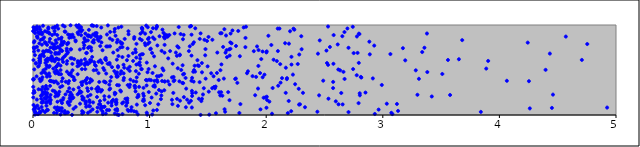
| Category | points |
|---|---|
| 0.28109599546678643 | 0.37 |
| 0.7863113055044358 | 0.845 |
| 1.2960913309117656 | 0.458 |
| 2.801998188422754 | 0.241 |
| 0.16181771673105594 | 0.604 |
| 0.9099683410911414 | 0.313 |
| 0.2542195787087051 | 0.408 |
| 0.7645871088876175 | 0.129 |
| 3.0653831028318614 | 0.677 |
| 0.04536244996746247 | 0.718 |
| 0.4148154742614242 | 0.255 |
| 0.612126337397182 | 0.209 |
| 0.9644126474792283 | 0.775 |
| 0.873292841236084 | 0.321 |
| 0.5744103137600461 | 0.155 |
| 0.8451699118751538 | 0.087 |
| 0.7014837666001149 | 0.956 |
| 0.7099957449931591 | 0.145 |
| 2.185443102822599 | 0.021 |
| 0.36488459420857033 | 0.829 |
| 0.7483094901119125 | 0.749 |
| 0.5154298040868802 | 0.14 |
| 1.422651659300616 | 0.181 |
| 0.11989597269200629 | 0.057 |
| 0.6742393291927324 | 0.105 |
| 1.3457181253958346 | 0.983 |
| 0.3166395095342625 | 0.217 |
| 0.16368926789285895 | 0.374 |
| 4.396175380391123 | 0.502 |
| 1.449192109160035 | 0.181 |
| 0.8124454490234898 | 0.332 |
| 0.6810174015349051 | 0.833 |
| 0.47061576387367976 | 0.828 |
| 1.4928285260325076 | 0.823 |
| 0.10559555967818714 | 0.234 |
| 0.13768098370966286 | 0.623 |
| 2.8887228357666133 | 0.674 |
| 1.4373071451709571 | 0.001 |
| 0.5260832207862275 | 0.587 |
| 0.7567741580359515 | 0.486 |
| 0.08518163146052737 | 0.156 |
| 0.19685831735046003 | 0.373 |
| 0.392828271827794 | 0.998 |
| 0.5034215476512914 | 0.996 |
| 0.9795665728010211 | 0.004 |
| 0.21746152402796293 | 0.569 |
| 0.807878517876689 | 0.134 |
| 0.29803660633935847 | 0.261 |
| 1.4478551683098297 | 0.577 |
| 0.008178629830245216 | 0.941 |
| 0.47750710594813695 | 0.88 |
| 1.822530957515877 | 0.856 |
| 0.10671213407645605 | 0.467 |
| 0.006809696880390757 | 0.397 |
| 1.9054204492945668 | 0.22 |
| 0.0022782317432472787 | 0.313 |
| 1.0565834999774417 | 0.238 |
| 1.4579257487413357 | 0.228 |
| 0.0066864243649958615 | 0.063 |
| 0.33525322000933105 | 0.182 |
| 0.8183220600249549 | 0.931 |
| 0.6975341210572045 | 0.488 |
| 0.010750208368703718 | 0.507 |
| 0.10274954593767766 | 0.93 |
| 1.8069591114970132 | 0.973 |
| 0.959359405926713 | 0.797 |
| 1.1570745501055428 | 0.374 |
| 0.6606424603605228 | 0.763 |
| 0.45542686348208516 | 0.149 |
| 1.5806516231195562 | 0.694 |
| 0.11711094740435125 | 0.229 |
| 1.5925587263448266 | 0.389 |
| 0.4323568750636553 | 0.17 |
| 0.2027263688608558 | 0.227 |
| 0.6401813209262813 | 0.57 |
| 0.17886499053350619 | 0.76 |
| 0.9744953770770636 | 0.328 |
| 1.2129411898262499 | 0.386 |
| 2.803512167857224 | 0.219 |
| 1.2339223007660027 | 0.657 |
| 0.8269142348347855 | 0.311 |
| 0.7227250923707312 | 0.006 |
| 0.4341578709901733 | 0.188 |
| 1.1954309971878077 | 0.121 |
| 2.652905260697742 | 0.875 |
| 2.7424425200390514 | 0.98 |
| 0.8051974629276178 | 0.143 |
| 2.7922946595932987 | 0.132 |
| 0.9489018695530124 | 0.176 |
| 1.0056012574371316 | 0.73 |
| 1.0996098690126193 | 0.442 |
| 0.623558677678183 | 0.361 |
| 0.3519580090501742 | 0.388 |
| 0.9077061325484465 | 0.459 |
| 0.212237688164748 | 0.757 |
| 0.318946827018784 | 0.15 |
| 0.3387722002727237 | 0.497 |
| 0.5353025863967446 | 0.877 |
| 2.13573315948738 | 0.409 |
| 0.40110861922577096 | 0.961 |
| 0.5112625787391253 | 0.062 |
| 0.3245431471020181 | 0.469 |
| 0.2936352133835687 | 0.787 |
| 0.4200373317503611 | 0.332 |
| 0.0022848786733070275 | 0.195 |
| 0.31454162487060655 | 0.185 |
| 0.06812205454689393 | 0.214 |
| 0.0029337382212216174 | 0.244 |
| 0.8822210689926815 | 0.487 |
| 0.29314228519259977 | 0.599 |
| 0.44322407191111723 | 0.84 |
| 0.147578795186086 | 0.625 |
| 1.1297907326937762 | 0.372 |
| 2.3154472970948254 | 0.246 |
| 2.176828873901453 | 0.398 |
| 0.29333463026984513 | 0.027 |
| 0.056577576162750255 | 0.4 |
| 0.8079132622280998 | 0.163 |
| 0.19301264486308106 | 0.748 |
| 0.5020560081204197 | 0.294 |
| 2.055290407586321 | 0.3 |
| 1.3779084621896573 | 0.371 |
| 3.13094968759662 | 0.046 |
| 0.6882769841099661 | 0.694 |
| 2.931168546218482 | 0.012 |
| 2.007725879750936 | 0.166 |
| 0.5770121253037834 | 0.857 |
| 0.8875025714419036 | 0.79 |
| 0.109141298462907 | 0.138 |
| 2.6134535740845983 | 0.784 |
| 1.8435997124892947 | 0.485 |
| 0.09863526435711628 | 0.702 |
| 2.884699186741174 | 0.815 |
| 1.311054185262152 | 0.086 |
| 5.3678784736487755 | 0.924 |
| 1.0739602473624885 | 0.118 |
| 0.033316075998391766 | 0.172 |
| 2.5339215925984524 | 0.181 |
| 2.283355356788008 | 0.672 |
| 0.7149654790019342 | 0.169 |
| 0.13095624996995522 | 0.958 |
| 0.004829298563082712 | 0.111 |
| 0.054134368203893404 | 0.795 |
| 1.283237326959879 | 0.553 |
| 0.5385145127430865 | 0.547 |
| 0.20743869203960538 | 0.992 |
| 0.9326941394640169 | 0.832 |
| 4.063943305541932 | 0.38 |
| 0.2361921551673881 | 0.548 |
| 0.6774797686923697 | 0.532 |
| 1.9345039205951968 | 0.721 |
| 0.7105825761295621 | 0.461 |
| 0.082745944338072 | 0.842 |
| 0.4853196671499762 | 0.879 |
| 1.096886526744139 | 0.176 |
| 0.5781437560162342 | 0.608 |
| 0.4892280986597576 | 0.096 |
| 0.12805181909543295 | 0.71 |
| 1.7699777814772488 | 0.022 |
| 0.0737890043361841 | 0.089 |
| 0.007978863445438246 | 0.806 |
| 3.3381410877551025 | 0.7 |
| 0.7669797201095317 | 0.644 |
| 1.9689947017046536 | 0.705 |
| 0.9033157007221936 | 0.225 |
| 0.3279914838374465 | 0.864 |
| 0.11923399621002748 | 0.05 |
| 0.19252998704531588 | 0.692 |
| 0.6278223789605939 | 0.461 |
| 0.9515608912782906 | 0.159 |
| 2.7950119231850015 | 0.904 |
| 0.3382113918667821 | 0.892 |
| 0.7073251374211335 | 0.242 |
| 1.4436310053345691 | 0.155 |
| 0.012571956811455507 | 0.251 |
| 2.530645478161302 | 0.557 |
| 1.022382369256952 | 0.006 |
| 1.5051274621728012 | 0.867 |
| 1.2412742147599052 | 0.519 |
| 3.3097977684137514 | 0.402 |
| 0.0007125348984679613 | 0.931 |
| 1.2578947214941063 | 0.663 |
| 0.05928462601509663 | 0.6 |
| 1.7604783932774395 | 0.934 |
| 4.432937171214745 | 0.682 |
| 0.07396418220168405 | 0.138 |
| 0.7578740032469024 | 0.98 |
| 0.06258506301556925 | 0.03 |
| 0.8292544833722038 | 0.49 |
| 0.003081269725103933 | 0.4 |
| 0.37147364615655337 | 0.995 |
| 1.1314671297863932 | 0.893 |
| 0.64231744490566 | 0.995 |
| 0.04782264155743999 | 0.286 |
| 0.07247311004661848 | 0.281 |
| 0.602877747344754 | 0.522 |
| 0.16393246131728018 | 0.888 |
| 0.33347912232007315 | 0.63 |
| 0.1100074077062833 | 0.798 |
| 0.1827011537346755 | 0.783 |
| 0.08287708891898421 | 0.233 |
| 0.19575961709494039 | 0.245 |
| 1.537235309482441 | 0.298 |
| 0.4712694916683558 | 0.267 |
| 2.705874692811272 | 0.747 |
| 0.24493897495769895 | 0.86 |
| 3.2828641155872913 | 0.496 |
| 3.6526011269044707 | 0.619 |
| 0.08614308286067045 | 0.992 |
| 0.13820158907321423 | 0.461 |
| 0.23719459273321641 | 0.775 |
| 4.261087284803229 | 0.073 |
| 4.707008862425556 | 0.612 |
| 0.8313490500352786 | 0.337 |
| 1.5384331424477156 | 0.836 |
| 0.08695615625192396 | 0.708 |
| 1.5521669434289873 | 0.311 |
| 0.3464843160264727 | 0.284 |
| 2.2292237406145414 | 0.449 |
| 0.722487358809856 | 0.435 |
| 0.4225660772888632 | 0.943 |
| 1.4224575041915126 | 0.545 |
| 0.9333337315708011 | 0.969 |
| 0.24066424968977007 | 0.453 |
| 0.7765041872390942 | 0.387 |
| 1.021335708361039 | 0.69 |
| 0.0789922464721686 | 0.912 |
| 2.6202276750776274 | 0.119 |
| 2.81573894137024 | 0.416 |
| 0.05504963456946509 | 0.602 |
| 0.5097903251077099 | 0.995 |
| 0.08231457284524905 | 0.051 |
| 0.5853078636823724 | 0.972 |
| 0.5843099716949577 | 0.079 |
| 3.381874532150111 | 0.477 |
| 0.4611513185513976 | 0.587 |
| 0.05869603538204341 | 0.594 |
| 0.07826264756854798 | 0.897 |
| 2.1204246293519318 | 0.565 |
| 0.7672641369130531 | 0.01 |
| 1.0459982700545705 | 0.541 |
| 2.530333529028507 | 0.983 |
| 0.055598946173039954 | 0.022 |
| 0.3006022124864148 | 0.696 |
| 4.24310937013456 | 0.804 |
| 0.7020071490459109 | 0.229 |
| 1.7410027817509297 | 0.767 |
| 0.013781992752652933 | 0.963 |
| 0.15191813977437466 | 0.168 |
| 1.1488812171439768 | 0.872 |
| 0.7128726296221539 | 0.144 |
| 0.7018437598503873 | 0.016 |
| 0.3848072123922433 | 0.577 |
| 0.17714973162236702 | 0.372 |
| 1.281327949112206 | 0.356 |
| 0.08437236263472873 | 0.255 |
| 0.44496366248436264 | 0.573 |
| 0.21797122184874282 | 0.458 |
| 0.07431850427141004 | 0.391 |
| 0.3831076006615354 | 0.23 |
| 1.0665897100052724 | 0.773 |
| 0.7499054237492401 | 0.457 |
| 0.8858897553679974 | 0.638 |
| 0.3490552041265348 | 0.864 |
| 0.2485106053405745 | 0.133 |
| 0.19786298137491132 | 0.245 |
| 0.80892193933003 | 0.184 |
| 0.6563034727441793 | 0.579 |
| 1.41346963096207 | 0.551 |
| 1.2881141981787085 | 0.353 |
| 0.6241367049485571 | 0.016 |
| 0.7744315962942802 | 0.141 |
| 0.2026750008820028 | 0.022 |
| 0.6618310766997146 | 0.294 |
| 0.10270850849356242 | 0.032 |
| 0.7820445342240077 | 0.526 |
| 0.12113041809410462 | 0.779 |
| 0.1411427428932185 | 0.626 |
| 0.18704497976882142 | 0.979 |
| 0.7192268910449955 | 0.435 |
| 0.42219985991350945 | 0.017 |
| 0.07046406470350466 | 0.92 |
| 2.241322056454322 | 0.948 |
| 0.4872585739206895 | 0.141 |
| 1.04095531885061 | 0.379 |
| 2.192997479925205 | 0.156 |
| 1.710555218863422 | 0.939 |
| 0.8587625413677461 | 0.6 |
| 0.23384711535749905 | 0.309 |
| 1.7031506365888855 | 0.796 |
| 0.42426124085001077 | 0.175 |
| 0.8778989138439822 | 0.728 |
| 1.0382122136398395 | 0.651 |
| 1.1690822254239759 | 0.889 |
| 0.04938423358636723 | 0.071 |
| 0.510625264913531 | 0.812 |
| 0.1852038682455222 | 0.265 |
| 0.06104560564933477 | 0.622 |
| 0.12243844337560046 | 0.445 |
| 0.300104463140919 | 0.894 |
| 2.2144442809551808 | 0.043 |
| 0.6541893245887503 | 0.338 |
| 1.3561565091904393 | 0.989 |
| 2.914783547936963 | 0.407 |
| 1.062799772993714 | 0.431 |
| 3.1724220433503847 | 0.742 |
| 0.3218597970587679 | 0.631 |
| 0.5767259991117617 | 0.766 |
| 0.3032584018100012 | 0.352 |
| 0.4398718883710106 | 0.775 |
| 1.122741282719865 | 0.867 |
| 0.054258030884870925 | 0.904 |
| 2.1232570168468845 | 0.359 |
| 1.8267872892064323 | 0.981 |
| 0.41216438299921765 | 0.976 |
| 0.8764185049566556 | 0.301 |
| 0.7207168633831024 | 0.066 |
| 2.5738725444416164 | 0.299 |
| 0.7063364653716339 | 0.059 |
| 0.07055532243006568 | 0.181 |
| 0.5010140915530992 | 0.715 |
| 2.8111918255716457 | 0.423 |
| 0.1710159755574358 | 0.627 |
| 2.7835215413832346 | 0.69 |
| 3.840800417180243 | 0.035 |
| 0.24712857693316967 | 0.076 |
| 0.5435776433303424 | 0.499 |
| 1.6929601374907828 | 0.735 |
| 1.4649325573924084 | 0.297 |
| 0.701078518852757 | 0.246 |
| 0.2703286135846564 | 0.02 |
| 5.1697369268363165 | 0.405 |
| 0.47054613909125775 | 0.207 |
| 0.719083234334744 | 0.615 |
| 0.39183975457708775 | 0.304 |
| 1.197963225583802 | 0.57 |
| 0.08555373633922393 | 0.68 |
| 1.0805817234119277 | 0.278 |
| 0.4923809976891693 | 0.398 |
| 1.4768998939320306 | 0.663 |
| 1.0559134048996506 | 0.961 |
| 0.03620445856838365 | 0.011 |
| 0.8120153703910429 | 0.058 |
| 0.45619293943047645 | 0.092 |
| 0.985508267490779 | 0.792 |
| 0.13129727765977012 | 0.972 |
| 0.889859725692748 | 0.418 |
| 0.08300699298665425 | 0.311 |
| 0.20794927041681296 | 0.889 |
| 0.12254894973703839 | 0.596 |
| 3.886973670971107 | 0.516 |
| 0.3893822147319713 | 0.898 |
| 0.382709080093621 | 0.916 |
| 1.3589609705931598 | 0.38 |
| 0.25063374051266724 | 0.619 |
| 0.0895315716433798 | 0.498 |
| 0.34578899725830625 | 0.192 |
| 0.22602339550302494 | 0.454 |
| 0.258899216711934 | 0.798 |
| 0.41921593185905326 | 0.509 |
| 0.026052861642226015 | 0.952 |
| 1.497654848473924 | 0.54 |
| 1.1100355551914933 | 0.948 |
| 0.15408973354757566 | 0.695 |
| 0.25621796717009343 | 0.995 |
| 1.1760638938127321 | 0.71 |
| 0.08054341098711569 | 0.138 |
| 0.0809733603380016 | 0.672 |
| 0.44476345567637815 | 0.554 |
| 0.13626572399641282 | 0.534 |
| 0.20046562890798353 | 0.495 |
| 0.4008246147630076 | 0.937 |
| 0.11162834934632826 | 0.323 |
| 1.243017299613853 | 0.102 |
| 0.6084460301092673 | 0.089 |
| 0.5661987176149319 | 0.291 |
| 0.5513771130280278 | 0.036 |
| 0.6191025464100501 | 0.366 |
| 0.20516792724005756 | 0.625 |
| 1.147367444803431 | 0.887 |
| 1.3917657855627361 | 0.963 |
| 1.2353789528448378 | 0.179 |
| 0.2227661473421627 | 0.682 |
| 1.2867628197833552 | 0.451 |
| 0.9312814195358193 | 0.51 |
| 0.2982941836935158 | 0.145 |
| 0.7250728812877498 | 0.722 |
| 0.6572814019277251 | 0.563 |
| 0.01855532299692703 | 0.943 |
| 2.1674277121121923 | 0.246 |
| 2.2900073388027877 | 0.118 |
| 0.6138329759114716 | 0.093 |
| 1.6065426736678574 | 0.908 |
| 0.060428214277214044 | 0.037 |
| 1.507444024409943 | 0.259 |
| 0.45456145717111923 | 0.39 |
| 1.2715010190812632 | 0.5 |
| 0.10715772795292647 | 0.58 |
| 2.102939477918318 | 0.325 |
| 2.991317083843083 | 0.334 |
| 0.4498651677147833 | 0.383 |
| 0.1638682126220233 | 0.793 |
| 0.9841803338928676 | 0.975 |
| 0.9419083074057217 | 0.676 |
| 0.3838157029365343 | 0.976 |
| 0.19132194113010334 | 0.206 |
| 0.29131680125147347 | 0.482 |
| 0.7220153391527837 | 0.048 |
| 0.7217153344213063 | 0.473 |
| 0.5918633832321389 | 0.276 |
| 1.893559574581589 | 0.709 |
| 0.28954593303854514 | 0.737 |
| 1.6511612095137789 | 0.693 |
| 0.0647216826967528 | 0.904 |
| 0.9777528345318611 | 0.385 |
| 0.671159029029341 | 0.422 |
| 0.393341584105714 | 0.588 |
| 1.0625433055509481 | 0.388 |
| 0.2895876923905509 | 0.713 |
| 2.0053396641472396 | 0.203 |
| 0.9863378338584825 | 0.844 |
| 0.2718247555139437 | 0.928 |
| 0.1882784419434141 | 0.97 |
| 0.25925203429756966 | 0.638 |
| 0.7292571093599025 | 0.529 |
| 1.0454603999876175 | 0.314 |
| 1.7788931396368632 | 0.121 |
| 2.7763178716750336 | 0.442 |
| 1.5959269599245773 | 0.252 |
| 1.3627744387862681 | 0.083 |
| 0.7176142959087238 | 0.425 |
| 0.47949154087913604 | 0.1 |
| 1.1028863149032415 | 0.262 |
| 0.03534011521052355 | 0.872 |
| 0.1850704568307822 | 0.48 |
| 0.2365111123418804 | 0.714 |
| 1.2612105108727603 | 0.159 |
| 0.9965252176764418 | 0.392 |
| 1.3381833762961937 | 0.137 |
| 1.734229988605894 | 0.4 |
| 1.1285578206596023 | 0.373 |
| 3.6810491004513275 | 0.832 |
| 1.2055969132131796 | 0.423 |
| 0.4507777693257991 | 0.145 |
| 1.3899772565426078 | 0.482 |
| 0.7349646292061113 | 0.001 |
| 0.36573403547281097 | 0.818 |
| 1.2486045880542853 | 0.749 |
| 0.21927045698831096 | 0.229 |
| 1.1918073140101417 | 0.169 |
| 0.14799218432479605 | 0.128 |
| 0.546087437313917 | 0.988 |
| 3.1923197754024697 | 0.607 |
| 0.7669588911105172 | 0.754 |
| 0.47069697739247784 | 0.565 |
| 2.643831953019708 | 0.245 |
| 0.6980302765365137 | 0.925 |
| 0.38445566448592006 | 0.598 |
| 1.128680131207001 | 0.779 |
| 3.357006008153795 | 0.747 |
| 1.017444670734777 | 0.194 |
| 0.4883460171159643 | 0.584 |
| 0.3176450360919995 | 0.885 |
| 1.1280108041815202 | 0.692 |
| 0.4023720049606228 | 0.727 |
| 0.043833683328893286 | 0.538 |
| 0.45348356345208846 | 0.823 |
| 0.018281023532212733 | 0.077 |
| 0.41312535170195264 | 0.886 |
| 0.03882589086135381 | 0.857 |
| 0.24442172137502194 | 0.718 |
| 0.42851037272214504 | 0.368 |
| 1.3694180481033362 | 0.788 |
| 0.12458510868755533 | 0.29 |
| 0.6623205340219588 | 0.923 |
| 2.778150229178464 | 0.873 |
| 0.9708405232078278 | 0.993 |
| 0.8908139095338122 | 0.116 |
| 2.6341778323449287 | 0.496 |
| 0.14523941890953743 | 0.846 |
| 0.40400658052997107 | 0.247 |
| 1.752491361777742 | 0.357 |
| 0.004474286176450394 | 0.61 |
| 0.4213731031318589 | 0.043 |
| 0.1503210467063839 | 0.223 |
| 0.9756838055237731 | 0.026 |
| 0.1990567889323361 | 0.537 |
| 0.18024163367800333 | 0.023 |
| 0.43441902447072 | 0.742 |
| 0.26595747490501304 | 0.812 |
| 0.7991235311140632 | 0.103 |
| 3.5771166643977934 | 0.222 |
| 0.5393273240753215 | 0.896 |
| 0.003483743551144528 | 0.974 |
| 0.49822463645455817 | 0.749 |
| 0.3002182334691156 | 0.028 |
| 0.5428648744575718 | 0.29 |
| 0.43373021496923847 | 0.804 |
| 1.2254117628565226 | 0.694 |
| 0.7322035581103583 | 0.971 |
| 0.013945137112504788 | 0.061 |
| 0.3309691896689172 | 0.434 |
| 0.716170737235947 | 0.136 |
| 1.2862073997157404 | 0.842 |
| 0.22778179214083463 | 0.743 |
| 0.08079959862103257 | 0.419 |
| 0.5449261536472448 | 0.911 |
| 0.16949500242422283 | 0.97 |
| 0.9365877080710245 | 0.964 |
| 0.050272432485653634 | 0.547 |
| 0.14550826759543667 | 0.379 |
| 0.9914648479058796 | 0.511 |
| 0.18052506426823745 | 0.364 |
| 0.45735810589015186 | 0.688 |
| 0.21950237185565194 | 0.848 |
| 4.450369071319271 | 0.079 |
| 0.03723500294024522 | 0.103 |
| 0.4281741302674245 | 0.176 |
| 0.8687710525228748 | 0.866 |
| 0.2159812739295339 | 0.96 |
| 0.9300699019107727 | 0.674 |
| 0.302654560486989 | 0.802 |
| 0.4409207721140332 | 0.854 |
| 1.396051861285804 | 0.25 |
| 0.7480229940856326 | 0.272 |
| 2.5213150467792595 | 0.577 |
| 0.5620105834512061 | 0.465 |
| 0.009205572173162301 | 0.705 |
| 0.27418375170841675 | 0.656 |
| 1.7399944345155858 | 0.405 |
| 1.1595805705330933 | 0.629 |
| 1.0289073112511915 | 0.964 |
| 0.06323510147160838 | 0.644 |
| 0.26073694610403253 | 0.189 |
| 1.6306018319598623 | 0.757 |
| 0.23964994700769368 | 0.843 |
| 1.0286318449185736 | 0.861 |
| 0.1463860781876951 | 0.323 |
| 0.6345495943515735 | 0.055 |
| 0.10444672174589395 | 0.251 |
| 0.18699521021685778 | 0.083 |
| 0.20936687603012497 | 0.085 |
| 0.059563371294229096 | 0.577 |
| 0.38297540345324027 | 0.453 |
| 0.4152295283733697 | 0.57 |
| 0.5795484791360767 | 0.87 |
| 0.11720392466245025 | 0.211 |
| 0.7490392367747409 | 0.811 |
| 0.03372753318267974 | 0.757 |
| 1.2034305648208201 | 0.245 |
| 4.569811922285747 | 0.871 |
| 0.6769894778872638 | 0.154 |
| 0.39548736153161074 | 0.551 |
| 0.4791409965627206 | 0.946 |
| 0.17386683390341776 | 0.516 |
| 1.774101869413421 | 0.653 |
| 3.4202742232049403 | 0.206 |
| 0.20145954551311285 | 0.802 |
| 2.9264202567872704 | 0.771 |
| 0.6251461013194407 | 0.61 |
| 0.2895781190146845 | 0.679 |
| 2.459441937988244 | 0.829 |
| 2.45357658309203 | 0.218 |
| 1.6240940698159636 | 0.214 |
| 2.5166600022042758 | 0.716 |
| 0.08130620729127991 | 0.844 |
| 0.1156321642979422 | 0.102 |
| 0.026336799808001417 | 0.575 |
| 0.7648203122081055 | 0.796 |
| 1.560543838819416 | 0.297 |
| 1.3630729851176364 | 0.268 |
| 1.2554852427491994 | 0.374 |
| 0.4748797910501944 | 0.748 |
| 0.062076479934772985 | 0.949 |
| 1.6476780383092111 | 0.036 |
| 0.7211717649422742 | 0.332 |
| 0.23020474872212215 | 0.076 |
| 0.867122768733115 | 0.847 |
| 1.5282497811390392 | 0.463 |
| 1.3861508806890972 | 0.547 |
| 0.01744336809067719 | 0.087 |
| 0.22590543951851458 | 0.258 |
| 2.027067980867093 | 0.149 |
| 1.9474797575723675 | 0.466 |
| 0.8990775721513297 | 0.007 |
| 0.012194519765404607 | 0.821 |
| 0.4138615605074506 | 0.362 |
| 0.9928270711329233 | 0.255 |
| 2.3038801762585637 | 0.731 |
| 0.5621101493207692 | 0.592 |
| 0.8564119141986372 | 0.686 |
| 0.45203077660219315 | 0.122 |
| 2.2047225029273694 | 0.93 |
| 2.5744093414323768 | 0.368 |
| 0.5210955917082604 | 0.833 |
| 0.07283033120972528 | 0.465 |
| 1.2061984294272932 | 0.376 |
| 1.119278480833139 | 0.913 |
| 4.753599369507766 | 0.788 |
| 0.12400305882407596 | 0.627 |
| 0.15117452554636435 | 0.38 |
| 1.1101762476180252 | 0.518 |
| 3.0342624839048153 | 0.125 |
| 0.5485655840776779 | 0.2 |
| 1.3542264336708487 | 0.157 |
| 1.8214965595370098 | 0.754 |
| 0.27913753087142834 | 0.02 |
| 0.07618490500458046 | 0.22 |
| 0.4531786036672171 | 0.576 |
| 1.470373542147215 | 0.835 |
| 1.2143326741642462 | 0.906 |
| 0.7288638086891993 | 0.542 |
| 0.32244141751858907 | 0.729 |
| 0.520274615597825 | 0.497 |
| 0.9039160155067161 | 0.567 |
| 0.12151278110305477 | 0.922 |
| 0.06451724575892484 | 0.659 |
| 0.8295345319229231 | 0.535 |
| 0.5685433340215075 | 0.367 |
| 0.582112387639793 | 0.064 |
| 1.118865245096531 | 0.496 |
| 1.1708163736871253 | 0.339 |
| 0.01626661033794034 | 0.005 |
| 0.24225541857233437 | 0.785 |
| 1.4289891839619815 | 0.365 |
| 2.1685097106301416 | 0.525 |
| 0.008443677552557614 | 0.27 |
| 0.9148215565680837 | 0.585 |
| 1.2920667812986186 | 0.89 |
| 0.2895101589849781 | 0.57 |
| 1.3798778352835128 | 0.807 |
| 0.03449160582989941 | 0.982 |
| 2.2169619827523674 | 0.56 |
| 1.9779778059597364 | 0.192 |
| 0.5071832859406767 | 0.645 |
| 1.98509602749346 | 0.448 |
| 0.6871915354596673 | 0.169 |
| 0.2460826441189455 | 0.374 |
| 0.8348805976221999 | 0.393 |
| 2.7455814978675264 | 0.51 |
| 0.31244474431173114 | 0.11 |
| 0.14382252863090267 | 0.194 |
| 0.15329659413796715 | 0.631 |
| 0.17317973547247603 | 0.744 |
| 2.270444415410981 | 0.566 |
| 1.237774540616886 | 0.763 |
| 0.9821240621964398 | 0.475 |
| 0.18628411366008946 | 0.596 |
| 0.7766227379318328 | 0.558 |
| 2.044184046232392 | 0.778 |
| 1.336694017931383 | 0.71 |
| 0.7195475486061618 | 0.807 |
| 3.121008858801551 | 0.123 |
| 0.19898276910417406 | 0.534 |
| 0.5537280680574046 | 0.843 |
| 0.32664058445295935 | 0.73 |
| 0.9451941397796945 | 0.237 |
| 0.3541184224946375 | 0.62 |
| 4.253355609123023 | 0.376 |
| 1.616008113809296 | 0.562 |
| 0.4957633983407015 | 0.868 |
| 0.12211939290660657 | 0.244 |
| 1.479323294575748 | 0.733 |
| 0.8184874042451182 | 0.656 |
| 1.3446583793187785 | 0.763 |
| 0.518727446379709 | 0.99 |
| 1.6869220620548193 | 0.66 |
| 0.7370000721584284 | 0.33 |
| 0.6136133444655361 | 0.171 |
| 1.2661685212077203 | 0.899 |
| 1.2495768490471495 | 0.978 |
| 2.2815786087127865 | 0.116 |
| 0.7250983634448431 | 0.835 |
| 1.6600287532528062 | 0.721 |
| 0.4449840799001505 | 0.62 |
| 0.09502523833948905 | 0.862 |
| 1.6818141826482687 | 0.729 |
| 0.11161405828134849 | 0.294 |
| 2.443929208128165 | 0.681 |
| 0.659551787933882 | 0.85 |
| 1.32173452441937 | 0.17 |
| 0.7795754061873457 | 0.412 |
| 0.11953942819939359 | 0.426 |
| 0.5557396859569259 | 0.31 |
| 0.4126537578991694 | 0.928 |
| 0.7266543735419896 | 0.428 |
| 1.6853478134654092 | 0.165 |
| 0.8407157157028341 | 0.056 |
| 1.5485949313228597 | 0.43 |
| 1.9510671436455012 | 0.063 |
| 0.01398707376859872 | 0.043 |
| 0.1097048186025215 | 0.178 |
| 0.619300876888484 | 0.621 |
| 0.514564433392218 | 0.894 |
| 0.09880593865977577 | 0.19 |
| 0.3154307027677599 | 0.887 |
| 2.1781962959822256 | 0.41 |
| 0.21429330295482818 | 0.35 |
| 0.008482178970898936 | 0.739 |
| 0.2487345753966825 | 0.712 |
| 0.32115164304555105 | 0.25 |
| 0.0647083396349211 | 0.834 |
| 0.5966274834006733 | 0.04 |
| 0.2717828397241358 | 0.983 |
| 0.14385921428938833 | 0.431 |
| 0.9619385191682929 | 0.109 |
| 1.0324140713825902 | 0.32 |
| 1.031516518187212 | 0.05 |
| 2.049989579823302 | 0.014 |
| 0.5023228452174447 | 0.603 |
| 0.6343937417190072 | 0.894 |
| 3.0822300601106636 | 0.01 |
| 0.4608279448457573 | 0.69 |
| 7.807327758296003 | 0.787 |
| 2.195051581030797 | 0.793 |
| 0.2227465420612973 | 0.053 |
| 0.12245777518993174 | 0.199 |
| 0.6552003770049777 | 0.283 |
| 0.881525104119762 | 0.697 |
| 0.4646196671786994 | 0.411 |
| 0.01779559756596466 | 0.031 |
| 1.992786398498508 | 0.195 |
| 1.0419266560991522 | 0.843 |
| 1.5772686531331914 | 0.467 |
| 0.5986682799598344 | 0.01 |
| 0.04424664562920752 | 0.92 |
| 2.6556429002850623 | 0.118 |
| 1.67418225453183 | 0.254 |
| 0.8190246309321563 | 0.045 |
| 0.10959311462806438 | 0.612 |
| 0.9194445146823007 | 0.626 |
| 0.6443362362170995 | 0.137 |
| 0.8868010195090409 | 0.561 |
| 0.9618097894908851 | 0.904 |
| 0.18579713987678761 | 0.902 |
| 0.4653136044169721 | 0.297 |
| 0.3249632627265786 | 0.196 |
| 2.6722545281659076 | 0.4 |
| 0.8416480006464228 | 0.047 |
| 2.964194509819317 | 0.06 |
| 0.14054352282684862 | 0.814 |
| 0.42066557816880773 | 0.206 |
| 0.05604502508376236 | 0.975 |
| 2.696368328941284 | 0.961 |
| 0.16932326804519743 | 0.271 |
| 2.5765720833278554 | 0.569 |
| 0.5215529983825965 | 0.806 |
| 0.8796048247545035 | 0.262 |
| 2.063490138665287 | 0.614 |
| 0.2779140082900841 | 0.924 |
| 0.01850601351973227 | 0.749 |
| 0.14235667490121748 | 0.544 |
| 0.06074479960803066 | 0.659 |
| 0.5856045987125897 | 0.096 |
| 1.5662807510215149 | 0.316 |
| 2.1620538151113564 | 0.798 |
| 2.0914658462805247 | 0.599 |
| 1.0116745823001838 | 0.387 |
| 0.1194001907243525 | 0.142 |
| 0.10918027060452906 | 0.514 |
| 0.12376512585157155 | 0.542 |
| 1.062777893485703 | 0.979 |
| 0.31065883969896363 | 0.452 |
| 3.378727527460438 | 0.905 |
| 0.16011193976383106 | 0.653 |
| 0.46923709357624227 | 0.881 |
| 0.20407231210727547 | 0.055 |
| 0.10279326105688234 | 0.809 |
| 1.0425450395028704 | 0.332 |
| 2.004348958458209 | 0.707 |
| 6.188330797764294 | 0.678 |
| 0.493038220231533 | 0.224 |
| 1.6636650474460977 | 0.643 |
| 0.48416919206998504 | 0.163 |
| 1.1008696840080234 | 0.217 |
| 0.11497199474136854 | 0.716 |
| 0.8194452730473315 | 0.897 |
| 0.30895369669012307 | 0.377 |
| 1.4806976071920828 | 0.404 |
| 7.412041743006562 | 0.88 |
| 1.0851728711858164 | 0.875 |
| 0.8856353393726755 | 0.035 |
| 1.5691377600384986 | 0.019 |
| 2.7990927776710777 | 0.899 |
| 0.33484751790580713 | 0.001 |
| 0.19999272203658336 | 0.626 |
| 1.6947836611890834 | 0.905 |
| 0.12742766063997307 | 0.056 |
| 0.7926178816503064 | 0.179 |
| 0.20978254369915464 | 0.147 |
| 0.6740735998125199 | 0.137 |
| 0.24734420194236167 | 0.813 |
| 2.0187861311195348 | 0.88 |
| 0.20668190462231362 | 0.682 |
| 1.0805406233476493 | 0.431 |
| 0.6286025198577133 | 0.762 |
| 0.017512604574303346 | 0.911 |
| 0.754572416019824 | 0.262 |
| 0.30044172268503083 | 0.13 |
| 0.07671166877520914 | 0.782 |
| 3.5104960107150123 | 0.456 |
| 1.6075668411059456 | 0.498 |
| 1.4373829315445013 | 0.907 |
| 1.0618713028219338 | 0.99 |
| 0.653064199509577 | 0.054 |
| 0.49183221438145597 | 0.041 |
| 2.2789999847166187 | 0.291 |
| 2.2480913191770755 | 0.342 |
| 1.929850314776938 | 0.294 |
| 0.13660111066287411 | 0.916 |
| 0.332900829837251 | 0.226 |
| 0.25767112957284116 | 0.59 |
| 0.5330020806567863 | 0.908 |
| 1.0253167936174405 | 0.467 |
| 2.001716812719348 | 0.695 |
| 0.9687186496693277 | 0.389 |
| 1.636932064195125 | 0.404 |
| 0.3476818053241567 | 0.068 |
| 0.10363779848712595 | 0.288 |
| 0.8716077959891377 | 0.324 |
| 0.1353946754071552 | 0.159 |
| 0.36585464855977035 | 0.09 |
| 1.3085578090675725 | 0.412 |
| 0.03487169713380145 | 0.873 |
| 1.1547548725614531 | 0.871 |
| 0.2362376615354754 | 0.006 |
| 0.2558094748350411 | 0.169 |
| 0.18160304884531892 | 0.607 |
| 0.09030330755151042 | 0.481 |
| 0.7078766731074202 | 0.88 |
| 1.613745927963208 | 0.253 |
| 1.1030470533897965 | 0.712 |
| 0.4744813274105428 | 0.747 |
| 0.8946897304169846 | 0.197 |
| 0.24604399282853578 | 0.041 |
| 0.2361648490407231 | 0.499 |
| 0.8119994454111507 | 0.514 |
| 1.3744760757041983 | 0.48 |
| 0.8854709778755347 | 0.371 |
| 0.2784670215285809 | 0.229 |
| 2.5784397399442995 | 0.888 |
| 2.100105379343371 | 0.71 |
| 0.11708628353951676 | 0.552 |
| 1.6428798044428232 | 0.064 |
| 0.14111473575077296 | 0.904 |
| 0.9368738414384319 | 0.953 |
| 0.8614044483798535 | 0.376 |
| 1.4102928677444826 | 0.609 |
| 1.003197758274244 | 0.133 |
| 0.9430511696079636 | 0.159 |
| 1.01171132743576 | 0.921 |
| 1.4299998103134695 | 0.845 |
| 0.563094805304341 | 0.824 |
| 0.9039632592339987 | 0.207 |
| 0.3814895890862327 | 0.542 |
| 1.3592451210736072 | 0.66 |
| 0.9758916665113108 | 0.582 |
| 1.3596448807054122 | 0.892 |
| 2.113852988733848 | 0.96 |
| 0.6630621378591062 | 0.377 |
| 0.05322631651666161 | 0.629 |
| 0.4483461986133473 | 0.51 |
| 0.2518949201110199 | 0.781 |
| 1.6057256785461427 | 0.217 |
| 0.09345298076821107 | 0.653 |
| 0.23823820968095627 | 0.16 |
| 0.5664943564488611 | 0.119 |
| 0.39566546965365557 | 0.248 |
| 0.2710157587200965 | 0.046 |
| 2.0022089593558046 | 0.08 |
| 0.8114129622136607 | 0.74 |
| 0.007044034712192348 | 0.75 |
| 1.3814586203902546 | 0.499 |
| 0.31131353856721333 | 0.297 |
| 2.098934111169882 | 0.96 |
| 0.1806227677710251 | 0.735 |
| 2.618358404184983 | 0.506 |
| 1.1917343077726437 | 0.417 |
| 0.3365615846907641 | 0.203 |
| 0.5533436338330803 | 0.262 |
| 0.9981617978592249 | 0.807 |
| 0.19157189489732426 | 0.679 |
| 0.6084444465853116 | 0.371 |
| 0.9299541240277545 | 0.511 |
| 1.3653330260164163 | 0.242 |
| 0.4333354401169448 | 0.029 |
| 0.5513190898119905 | 0.872 |
| 0.9502764277953739 | 0.214 |
| 1.9214666581240962 | 0.761 |
| 0.030714538124575058 | 0.429 |
| 0.4900930179327817 | 0.611 |
| 0.45896889533443175 | 0.353 |
| 1.9329321665859112 | 0.545 |
| 0.15072602704463522 | 0.749 |
| 2.5969315561732844 | 0.152 |
| 2.749938388231841 | 0.688 |
| 0.3109002341322223 | 0.456 |
| 0.7135556639182856 | 0.119 |
| 3.90372644526193 | 0.601 |
| 0.5746812256564193 | 0.121 |
| 2.6625605362371068 | 0.479 |
| 0.14616444334828152 | 0.151 |
| 0.33781241933975364 | 0.568 |
| 0.4131995487722825 | 0.606 |
| 0.21275696701001784 | 0.214 |
| 1.260050923612729 | 0.671 |
| 0.21822894055800768 | 0.689 |
| 0.5962953952803729 | 0.719 |
| 1.9136246767407707 | 0.423 |
| 1.0675013070348562 | 0.369 |
| 0.1995828428824996 | 0.746 |
| 0.4849570159664818 | 0.757 |
| 0.47449088591855126 | 0.884 |
| 0.40298615436578045 | 0.265 |
| 3.07338182369547 | 0.024 |
| 0.5871921168229536 | 0.806 |
| 0.9390602871598349 | 0.925 |
| 1.1259585342143912 | 0.275 |
| 0.1051565901835086 | 0.801 |
| 1.0105488932750235 | 0.737 |
| 0.19304920699383865 | 0.462 |
| 0.024038213135835897 | 0.573 |
| 1.6413887452377594 | 0.954 |
| 0.4715331472368911 | 0.025 |
| 0.9159929976389266 | 0.664 |
| 2.2165848414948517 | 0.646 |
| 4.9236506323867815 | 0.082 |
| 0.0161340537871776 | 0.969 |
| 1.3645108093570697 | 0.413 |
| 0.9932676636700085 | 0.857 |
| 1.655597933168247 | 0.883 |
| 0.5818506303696875 | 0.26 |
| 1.1295653667826777 | 0.851 |
| 0.25103192398137897 | 0.321 |
| 0.7586677329681991 | 0.792 |
| 2.488946541786622 | 0.381 |
| 0.732903578910183 | 0.655 |
| 0.4488760675002106 | 0.905 |
| 2.233760690807054 | 0.959 |
| 0.5058971050689273 | 0.383 |
| 1.4493573971609506 | 0.474 |
| 1.9578772734940515 | 0.621 |
| 0.035734993324245234 | 0.954 |
| 0.20758673283712764 | 0.549 |
| 0.5901546031019012 | 0.087 |
| 0.5908172300997911 | 0.58 |
| 0.21270952044393074 | 0.477 |
| 2.3328188904398677 | 0.086 |
| 0.9217714825243398 | 0.904 |
| 0.002888616586746312 | 0.392 |
| 0.8057081917683441 | 0.609 |
| 1.5115829565747556 | 0.004 |
| 1.3647302355789477 | 0.211 |
| 3.2972229515020284 | 0.224 |
| 0.403464991122532 | 0.126 |
| 0.3476728918583943 | 0.419 |
| 0.947764079962314 | 0.302 |
| 2.3009420903750772 | 0.875 |
| 0.1847584474191161 | 0.933 |
| 0.3220710047161678 | 0.997 |
| 0.29543188634868295 | 0.792 |
| 1.3135847011771662 | 0.293 |
| 0.7776126805675309 | 0.462 |
| 0.19468904658810413 | 0.829 |
| 2.438793871464131 | 0.036 |
| 0.5537685904231512 | 0.082 |
| 0.3215246344749376 | 0.177 |
| 0.22125477578200706 | 0.616 |
| 1.9694922494963785 | 0.419 |
| 2.7940140370225905 | 0.579 |
| 2.546428396205186 | 0.756 |
| 1.2936379064342036 | 0.199 |
| 2.8514081104636784 | 0.249 |
| 4.45949531013882 | 0.226 |
| 0.4866417966254598 | 0.362 |
| 0.6417281249297816 | 0.762 |
| 1.8828474823448076 | 0.432 |
| 0.5318488337103457 | 0.556 |
| 3.558767858229428 | 0.611 |
| 0.6117495331204608 | 0.499 |
| 0.9165443780691949 | 0.846 |
| 0.1371518995959052 | 0.714 |
| 0.3117756120561313 | 0.857 |
| 0.6527338079271645 | 0.204 |
| 1.617347705417764 | 0.909 |
| 0.045364868650096264 | 0.011 |
| 2.7060176025975724 | 0.032 |
| 0.020661021657798716 | 0.031 |
| 0.865544035715872 | 0.041 |
| 0.9185723301809433 | 0.551 |
| 1.1070535331293816 | 0.378 |
| 1.062553941632985 | 0.056 |
| 0.016831032120973876 | 0.665 |
| 1.6921672667802783 | 0.806 |
| 1.8356396937037909 | 0.464 |
| 0.41214695073154844 | 0.942 |
| 0.3570701212353957 | 0.39 |
| 0.6234309817332175 | 0.634 |
| 2.6711958244384744 | 0.922 |
| 0.06404387071198454 | 0.376 |